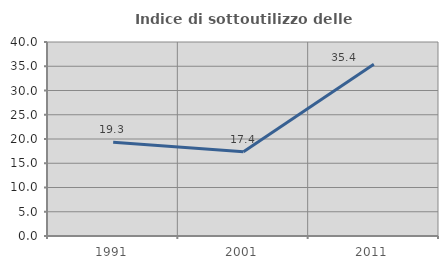
| Category | Indice di sottoutilizzo delle abitazioni  |
|---|---|
| 1991.0 | 19.315 |
| 2001.0 | 17.361 |
| 2011.0 | 35.401 |